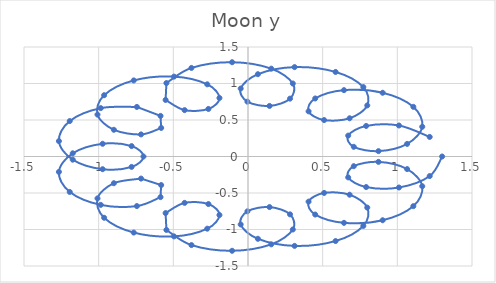
| Category | Moon y |
|---|---|
| 1.216717316654695 | 0.268 |
| 1.0109518571732719 | 0.425 |
| 0.7910600538040818 | 0.419 |
| 0.6709487507342877 | 0.286 |
| 0.7083514179826693 | 0.133 |
| 0.8735620915125341 | 0.073 |
| 1.0655750909597186 | 0.172 |
| 1.1668816283824528 | 0.407 |
| 1.1072199295151743 | 0.68 |
| 0.9017220926874318 | 0.873 |
| 0.6427794553062678 | 0.909 |
| 0.4500356816549361 | 0.795 |
| 0.40561416016221313 | 0.619 |
| 0.509690202279168 | 0.499 |
| 0.6804903506049572 | 0.524 |
| 0.7987187989921557 | 0.7 |
| 0.7723286224403045 | 0.951 |
| 0.5865273300587719 | 1.158 |
| 0.31191015830896063 | 1.224 |
| 0.06631189606246332 | 1.127 |
| -0.048944523229488446 | 0.931 |
| -0.003845882338882639 | 0.751 |
| 0.14417038942309848 | 0.693 |
| 0.281481107755737 | 0.793 |
| 0.30000000000000004 | 1 |
| 0.15590006869711037 | 1.203 |
| -0.10649607770551076 | 1.292 |
| -0.37860851151033187 | 1.213 |
| -0.5463242975591978 | 1.006 |
| -0.5517220926874317 | 0.775 |
| -0.4243389470603958 | 0.635 |
| -0.26503125307137343 | 0.652 |
| -0.1911787257631261 | 0.802 |
| -0.2729347909658378 | 0.989 |
| -0.4950801539799885 | 1.094 |
| -0.765157777218211 | 1.042 |
| -0.9634800516951638 | 0.839 |
| -1.0079015731878866 | 0.574 |
| -0.898247030245311 | 0.366 |
| -0.7163118960624635 | 0.302 |
| -0.581435921488856 | 0.391 |
| -0.5857317317052739 | 0.556 |
| -0.7440790139723205 | 0.679 |
| -0.9859908802639675 | 0.663 |
| -1.1937616146076375 | 0.485 |
| -1.2662175715229744 | 0.211 |
| -1.1735144476532962 | -0.044 |
| -0.9732775454556838 | -0.174 |
| -0.779336140201849 | -0.143 |
| -0.7 | 0 |
| -0.7793361402018484 | 0.143 |
| -0.973277545455683 | 0.174 |
| -1.1735144476532955 | 0.044 |
| -1.2662175715229744 | -0.211 |
| -1.193761614607638 | -0.485 |
| -0.9859908802639683 | -0.663 |
| -0.7440790139723215 | -0.679 |
| -0.5857317317052749 | -0.556 |
| -0.5814359214888555 | -0.391 |
| -0.7163118960624628 | -0.302 |
| -0.8982470302453094 | -0.366 |
| -1.0079015731878866 | -0.574 |
| -0.9634800516951645 | -0.839 |
| -0.7651577772182107 | -1.042 |
| -0.49508015397998956 | -1.094 |
| -0.2729347909658371 | -0.989 |
| -0.19117872576312622 | -0.802 |
| -0.26503125307137304 | -0.652 |
| -0.42433894706039454 | -0.635 |
| -0.5517220926874314 | -0.775 |
| -0.5463242975591989 | -1.006 |
| -0.37860851151033237 | -1.213 |
| -0.1064960777055108 | -1.292 |
| 0.1559000686971092 | -1.203 |
| 0.2999999999999998 | -1 |
| 0.28148110775573615 | -0.793 |
| 0.14417038942309934 | -0.693 |
| -0.003845882338882445 | -0.751 |
| -0.048944523229488474 | -0.931 |
| 0.0663118960624626 | -1.127 |
| 0.311910158308961 | -1.224 |
| 0.5865273300587699 | -1.158 |
| 0.7723286224403036 | -0.951 |
| 0.7987187989921558 | -0.7 |
| 0.6804903506049599 | -0.524 |
| 0.5096902022791674 | -0.499 |
| 0.40561416016221363 | -0.619 |
| 0.4500356816549349 | -0.795 |
| 0.642779455306268 | -0.909 |
| 0.9017220926874308 | -0.873 |
| 1.1072199295151735 | -0.68 |
| 1.1668816283824528 | -0.407 |
| 1.065575090959719 | -0.172 |
| 0.8735620915125354 | -0.073 |
| 0.7083514179826711 | -0.133 |
| 0.6709487507342876 | -0.286 |
| 0.7910600538040808 | -0.419 |
| 1.0109518571732692 | -0.425 |
| 1.2167173166546954 | -0.268 |
| 1.3 | 0 |